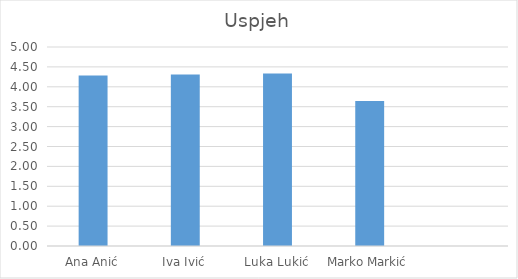
| Category | Uspjeh |
|---|---|
| Ana Anić | 4.286 |
| Iva Ivić | 4.308 |
| Luka Lukić | 4.333 |
| Marko Markić | 3.643 |